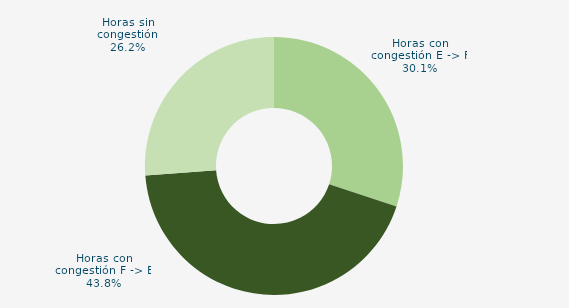
| Category | Horas con congestión E -> F |
|---|---|
| Horas con congestión E -> F | 30.067 |
| Horas con congestión F -> E | 43.758 |
| Horas sin congestión | 26.174 |